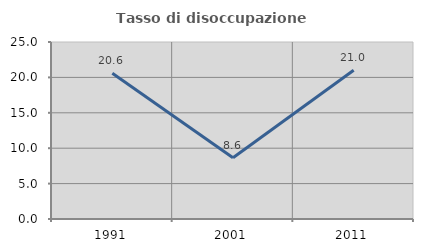
| Category | Tasso di disoccupazione giovanile  |
|---|---|
| 1991.0 | 20.588 |
| 2001.0 | 8.642 |
| 2011.0 | 21 |